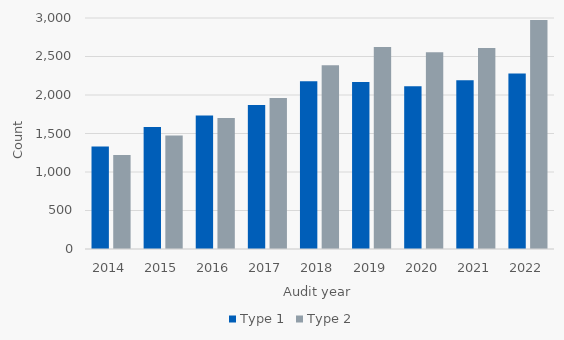
| Category | Type 1 | Type 2 |
|---|---|---|
| 2014.0 | 1330 | 1220 |
| 2015.0 | 1585 | 1475 |
| 2016.0 | 1735 | 1700 |
| 2017.0 | 1870 | 1960 |
| 2018.0 | 2180 | 2385 |
| 2019.0 | 2170 | 2625 |
| 2020.0 | 2115 | 2555 |
| 2021.0 | 2190 | 2610 |
| 2022.0 | 2280 | 2975 |